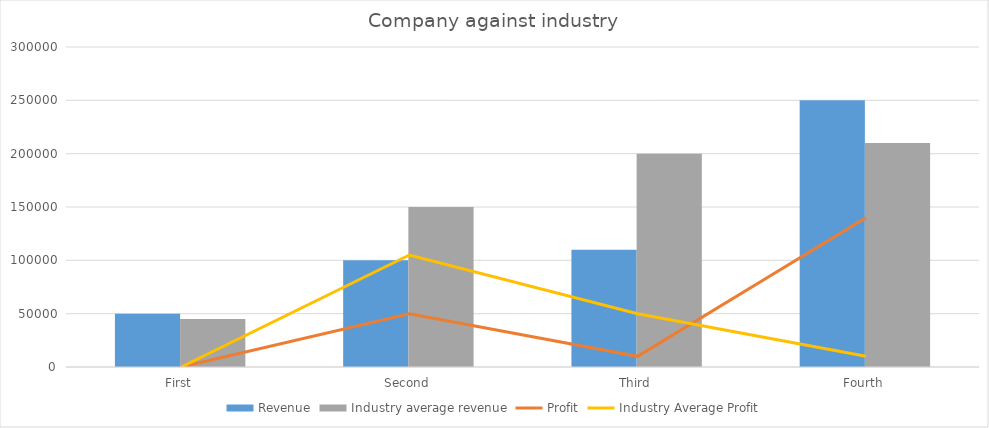
| Category | Revenue | Industry average revenue |
|---|---|---|
| First | 50000 | 45000 |
| Second | 100000 | 150000 |
| Third | 110000 | 200000 |
| Fourth | 250000 | 210000 |